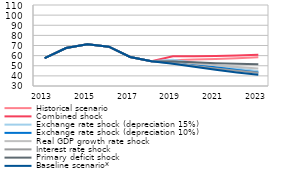
| Category | Historical scenario | Combined shock | Exchange rate shock (depreciation 15%) | Exchange rate shock (depreciation 10%) | Real GDP growth rate shock | Interest rate shock | Primary deficit shock | Baseline scenario* |
|---|---|---|---|---|---|---|---|---|
| 2013.0 | 57.484 | 57.484 | 57.484 | 57.484 | 57.484 | 57.484 | 57.484 | 57.484 |
| 2014.0 | 67.495 | 67.495 | 67.495 | 67.495 | 67.495 | 67.495 | 67.495 | 67.495 |
| 2015.0 | 71.249 | 71.249 | 71.249 | 71.249 | 71.249 | 71.249 | 71.249 | 71.249 |
| 2016.0 | 68.804 | 68.804 | 68.804 | 68.804 | 68.804 | 68.804 | 68.804 | 68.804 |
| 2017.0 | 58.693 | 58.693 | 58.693 | 58.693 | 58.693 | 58.693 | 58.693 | 58.693 |
| 2018.0 | 54.495 | 54.495 | 54.495 | 54.495 | 54.495 | 54.495 | 54.495 | 54.495 |
| 2019.0 | 55.446 | 59.381 | 55.956 | 54.439 | 54.33 | 52.413 | 54.303 | 51.903 |
| 2020.0 | 56.151 | 59.495 | 52.888 | 51.399 | 52.337 | 49.875 | 53.365 | 48.908 |
| 2021.0 | 56.706 | 59.704 | 49.939 | 48.471 | 50.408 | 47.342 | 52.51 | 46.015 |
| 2022.0 | 57.523 | 60.173 | 47.291 | 45.844 | 48.728 | 45.15 | 51.926 | 43.423 |
| 2023.0 | 58.406 | 60.848 | 44.853 | 43.422 | 47.217 | 43.202 | 51.532 | 41.03 |